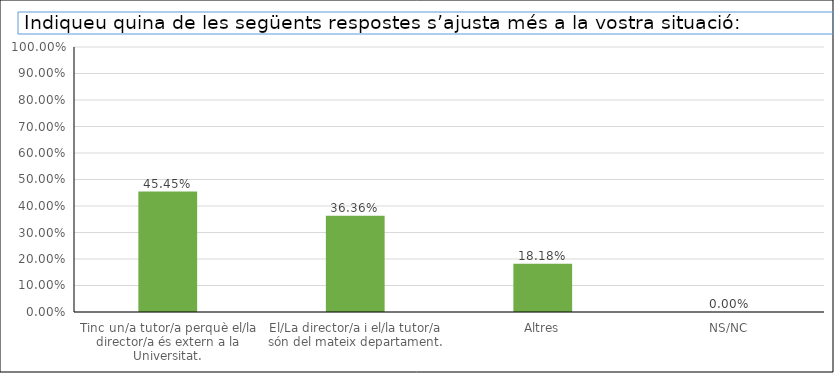
| Category | Series 0 |
|---|---|
| Tinc un/a tutor/a perquè el/la director/a és extern a la Universitat. | 0.455 |
| El/La director/a i el/la tutor/a són del mateix departament. | 0.364 |
| Altres | 0.182 |
| NS/NC | 0 |